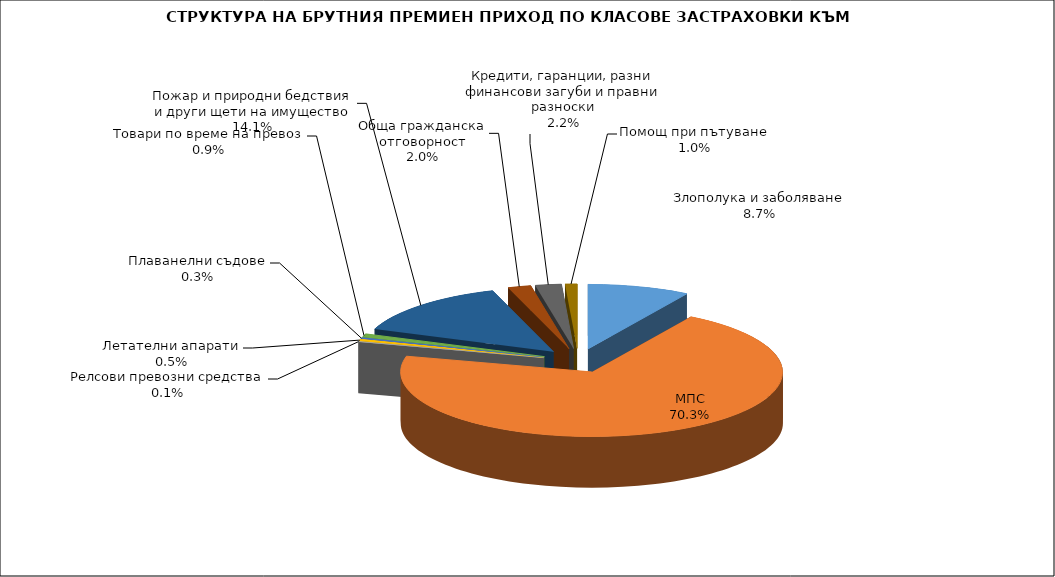
| Category | Злополука и заболяване |
|---|---|
| Злополука и заболяване | 0.087 |
| МПС | 0.703 |
| Релсови превозни средства | 0.001 |
| Летателни апарати | 0.005 |
| Плаванелни съдове | 0.003 |
| Товари по време на превоз | 0.009 |
| Пожар и природни бедствия и други щети на имущество | 0.141 |
| Обща гражданска отговорност | 0.02 |
| Кредити, гаранции, разни финансови загуби и правни разноски | 0.022 |
| Помощ при пътуване | 0.01 |